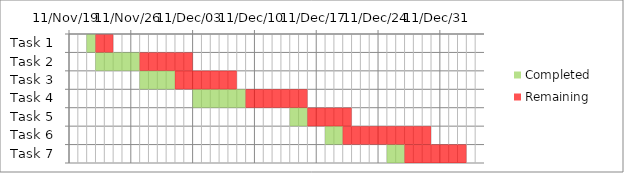
| Category | Start date | Completed | Remaining |
|---|---|---|---|
| Task 1 | 2011-11-21 | 1 | 2 |
| Task 2 | 2011-11-22 | 5 | 6 |
| Task 3 | 2011-11-27 | 4 | 7 |
| Task 4 | 2011-12-03 | 6 | 7 |
| Task 5 | 2011-12-14 | 2 | 5 |
| Task 6 | 2011-12-18 | 2 | 10 |
| Task 7 | 2011-12-25 | 2 | 7 |